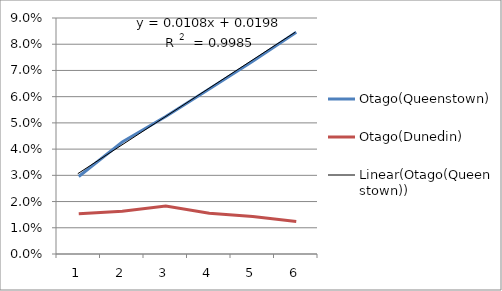
| Category | Otago(Queenstown) | Otago(Dunedin) |
|---|---|---|
| 0 | 0.03 | 0.015 |
| 1 | 0.043 | 0.016 |
| 2 | 0.052 | 0.018 |
| 3 | 0.063 | 0.016 |
| 4 | 0.074 | 0.014 |
| 5 | 0.085 | 0.012 |